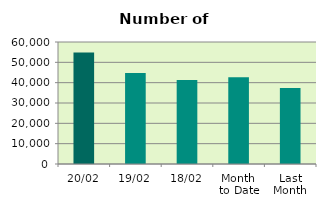
| Category | Series 0 |
|---|---|
| 20/02 | 54788 |
| 19/02 | 44784 |
| 18/02 | 41258 |
| Month 
to Date | 42642 |
| Last
Month | 37374.818 |